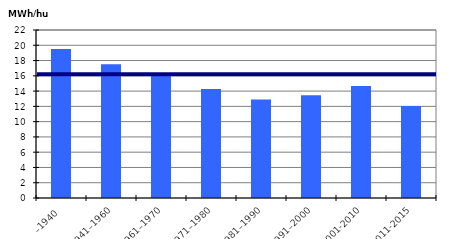
| Category | MWH/hus |
|---|---|
| –1940 | 19.521 |
| 1941–1960 | 17.506 |
| 1961–1970 | 16.125 |
| 1971–1980 | 14.279 |
| 1981–1990 | 12.883 |
| 1991–2000 | 13.445 |
| 2001-2010 | 14.681 |
| 2011-2015 | 12.037 |